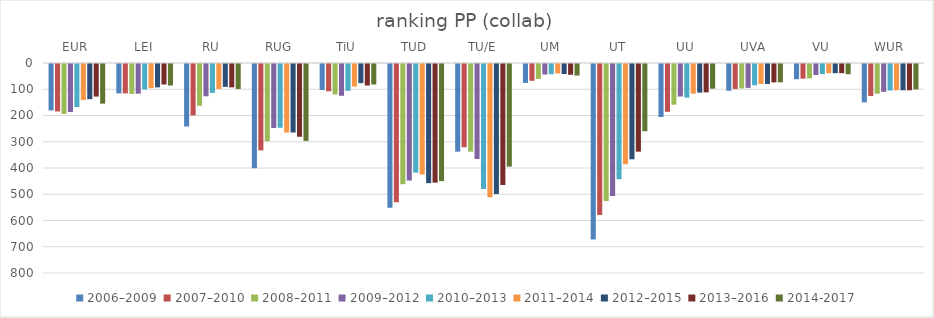
| Category | 2006–2009 | 2007–2010 | 2008–2011 | 2009–2012 | 2010–2013 | 2011–2014 | 2012–2015 | 2013–2016 | 2014-2017 |
|---|---|---|---|---|---|---|---|---|---|
| EUR | 177 | 181 | 190 | 183 | 164 | 137 | 134 | 124 | 151 |
| LEI | 112 | 112 | 114 | 113 | 97 | 92 | 89 | 78 | 82 |
| RU | 238 | 196 | 159 | 123 | 110 | 95 | 87 | 89 | 95 |
| RUG | 397 | 329 | 294 | 244 | 243 | 261 | 261 | 277 | 293 |
| TiU | 99 | 104 | 116 | 121 | 102 | 86 | 73 | 82 | 78 |
| TUD | 548 | 527 | 458 | 444 | 414 | 421 | 454 | 452 | 446 |
| TU/E | 334 | 317 | 334 | 362 | 476 | 508 | 495 | 461 | 391 |
| UM | 72 | 64 | 57 | 40 | 39 | 36 | 38 | 41 | 44 |
| UT | 669 | 575 | 522 | 503 | 439 | 382 | 363 | 334 | 256 |
| UU | 202 | 182 | 155 | 124 | 128 | 113 | 109 | 108 | 94 |
| UVA | 102 | 95 | 93 | 91 | 81 | 76 | 76 | 70 | 70 |
| VU | 58 | 56 | 55 | 42 | 38 | 35 | 35 | 35 | 39 |
| WUR | 146 | 122 | 113 | 106 | 101 | 100 | 100 | 100 | 97 |